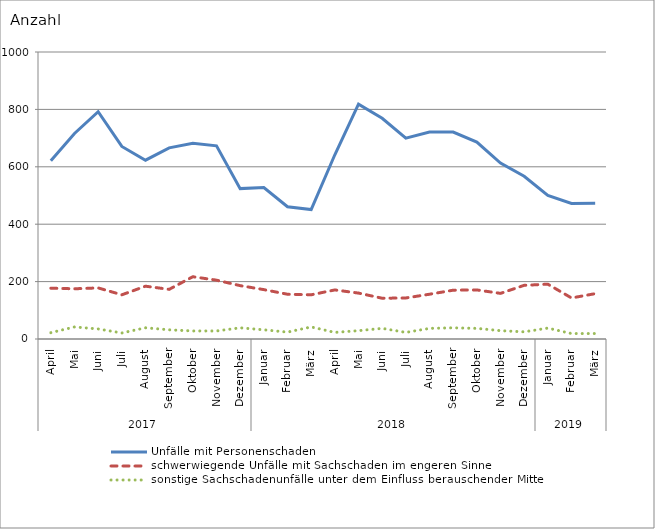
| Category | Unfälle mit Personenschaden | schwerwiegende Unfälle mit Sachschaden im engeren Sinne | sonstige Sachschadenunfälle unter dem Einfluss berauschender Mittel |
|---|---|---|---|
| 0 | 621 | 177 | 22 |
| 1 | 716 | 175 | 42 |
| 2 | 792 | 178 | 35 |
| 3 | 671 | 154 | 21 |
| 4 | 623 | 184 | 39 |
| 5 | 666 | 173 | 32 |
| 6 | 682 | 217 | 28 |
| 7 | 673 | 205 | 28 |
| 8 | 524 | 186 | 39 |
| 9 | 528 | 172 | 32 |
| 10 | 461 | 156 | 24 |
| 11 | 451 | 154 | 42 |
| 12 | 642 | 171 | 23 |
| 13 | 818 | 160 | 29 |
| 14 | 769 | 142 | 37 |
| 15 | 700 | 143 | 23 |
| 16 | 721 | 156 | 37 |
| 17 | 721 | 170 | 39 |
| 18 | 686 | 171 | 37 |
| 19 | 613 | 159 | 29 |
| 20 | 567 | 187 | 25 |
| 21 | 500 | 191 | 38 |
| 22 | 472 | 143 | 19 |
| 23 | 473 | 158 | 19 |